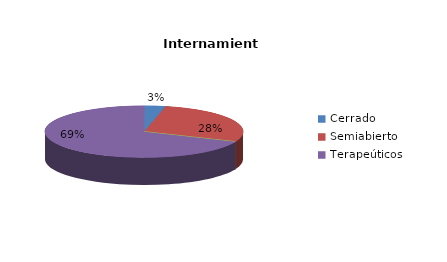
| Category | Series 0 |
|---|---|
| Cerrado | 3 |
| Semiabierto | 24 |
| Abierto | 0 |
| Terapeúticos | 59 |